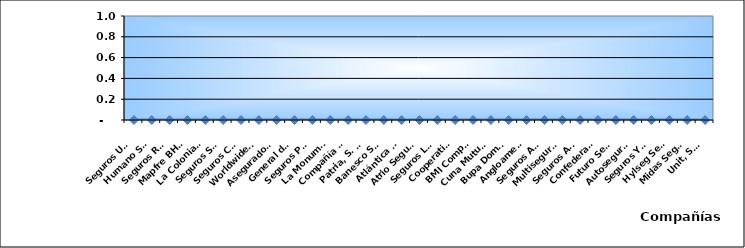
| Category | Series 0 |
|---|---|
| Seguros Universal, S. A. | 0 |
| Humano Seguros, S. A. | 0 |
| Seguros Reservas, S. A. | 0 |
| Mapfre BHD Compañía de Seguros | 0 |
| La Colonial, S. A., Compañia De Seguros | 0 |
| Seguros Sura, S.A. | 0 |
| Seguros Crecer, S. A. | 0 |
| Worldwide Seguros, S. A. | 0 |
| Aseguradora Agropecuaria Dominicana, S. A. | 0 |
| General de Seguros, S. A. | 0 |
| Seguros Pepín, S. A. | 0 |
| La Monumental de Seguros, S. A. | 0 |
| Compañía Dominicana de Seguros, C. por A. | 0 |
| Patria, S. A., Compañía de Seguros | 0 |
| Banesco Seguros | 0 |
| Atlántica Seguros, S. A. | 0 |
| Atrio Seguros S. A. | 0 |
| Seguros La Internacional, S. A. | 0 |
| Cooperativa Nacional De Seguros, Inc  | 0 |
| BMI Compañía de Seguros, S. A. | 0 |
| Cuna Mutual Insurance Society Dominicana | 0 |
| Bupa Dominicana, S. A. | 0 |
| Angloamericana de Seguros, S. A. | 0 |
| Seguros APS, S.R.L. | 0 |
| Multiseguros Su, S.A. | 0 |
| Seguros Ademi, S.A. | 0 |
| Confederación del Canadá Dominicana, S. A. | 0 |
| Futuro Seguros | 0 |
| Autoseguro, S. A. | 0 |
| Seguros Yunen, S.A. | 0 |
| Hylseg Seguros S.A | 0 |
| Midas Seguros, S.A. | 0 |
| Unit, S.A. | 0 |